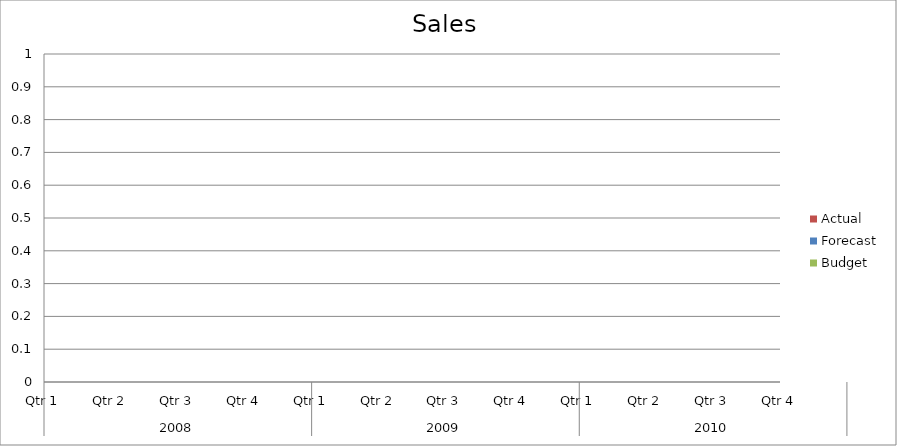
| Category | Budget | Forecast | Actual |
|---|---|---|---|
| 0 | 1370 | 2840 | 1830 |
| 1 | 910 | 3260 | 2540 |
| 2 | 1290 | 2390 | 590 |
| 3 | 1490 | 3310 | 840 |
| 4 | 650 | 3260 | 3170 |
| 5 | 570 | 1040 | 1360 |
| 6 | 740 | 3200 | 1060 |
| 7 | 1450 | 2690 | 830 |
| 8 | 2990 | 1110 | 1840 |
| 9 | 1440 | 590 | 900 |
| 10 | 1140 | 890 | 2160 |
| 11 | 1570 | 3440 | 600 |